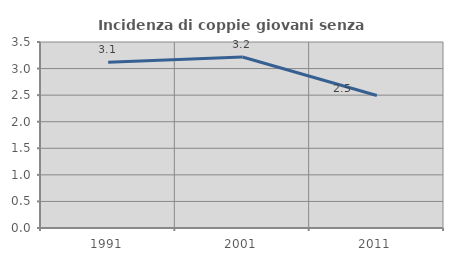
| Category | Incidenza di coppie giovani senza figli |
|---|---|
| 1991.0 | 3.121 |
| 2001.0 | 3.218 |
| 2011.0 | 2.494 |